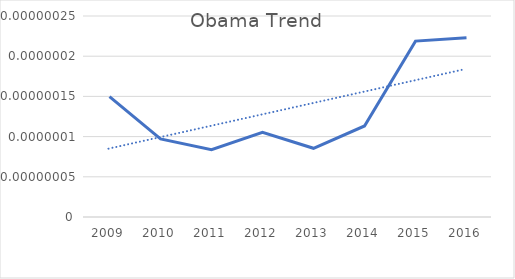
| Category | Series 0 |
|---|---|
| 2009.0 | 0 |
| 2010.0 | 0 |
| 2011.0 | 0 |
| 2012.0 | 0 |
| 2013.0 | 0 |
| 2014.0 | 0 |
| 2015.0 | 0 |
| 2016.0 | 0 |